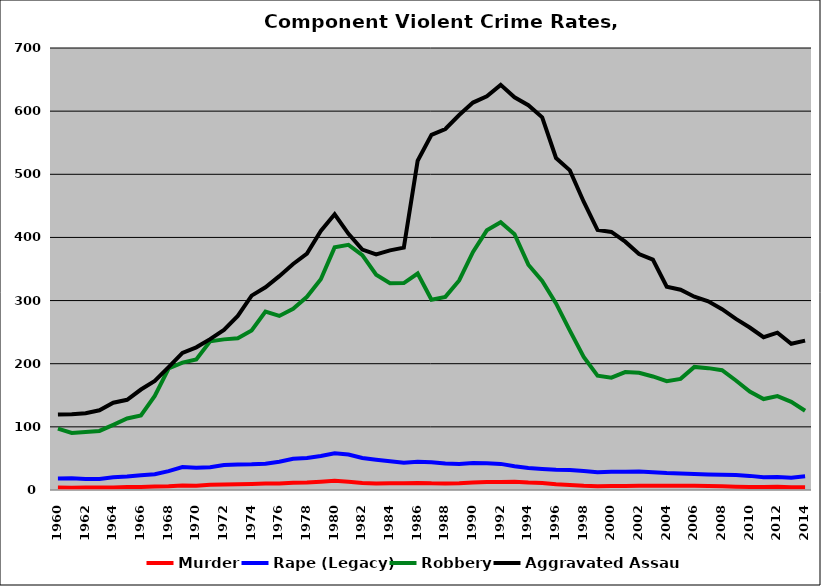
| Category | Murder | Rape (Legacy) | Robbery | Aggravated Assault |
|---|---|---|---|---|
| 1960.0 | 3.919 | 18.19 | 97.263 | 119.589 |
| 1961.0 | 3.69 | 18.497 | 90.456 | 120.046 |
| 1962.0 | 3.872 | 17.36 | 91.915 | 121.656 |
| 1963.0 | 3.826 | 17.51 | 93.565 | 126.254 |
| 1964.0 | 4.092 | 20.023 | 103.224 | 138.233 |
| 1965.0 | 4.731 | 21.224 | 113.327 | 142.893 |
| 1966.0 | 4.588 | 23.427 | 117.967 | 159.113 |
| 1967.0 | 5.425 | 25.02 | 149.005 | 172.694 |
| 1968.0 | 5.983 | 29.884 | 192.451 | 194.62 |
| 1969.0 | 7.129 | 36.275 | 201.821 | 217.04 |
| 1970.0 | 6.896 | 35.107 | 206.87 | 225.944 |
| 1971.0 | 8.119 | 36.098 | 235.504 | 238.857 |
| 1972.0 | 8.75 | 39.706 | 238.563 | 253.664 |
| 1973.0 | 9.038 | 40.566 | 240.43 | 275.778 |
| 1974.0 | 9.494 | 40.628 | 252.652 | 307.825 |
| 1975.0 | 10.427 | 41.572 | 282.403 | 320.977 |
| 1976.0 | 10.316 | 44.675 | 275.641 | 338.704 |
| 1977.0 | 11.486 | 49.438 | 287.048 | 358.011 |
| 1978.0 | 11.712 | 50.758 | 306.069 | 374.379 |
| 1979.0 | 13.007 | 53.926 | 333.834 | 410.332 |
| 1980.0 | 14.495 | 58.187 | 384.232 | 436.695 |
| 1981.0 | 13.01 | 56.153 | 388.182 | 405.625 |
| 1982.0 | 11.24 | 50.675 | 372.06 | 380.735 |
| 1983.0 | 10.483 | 48.038 | 340.931 | 373.135 |
| 1984.0 | 10.604 | 45.672 | 327.547 | 379.541 |
| 1985.0 | 10.506 | 43.319 | 327.658 | 383.785 |
| 1986.0 | 11.26 | 44.917 | 342.878 | 521.482 |
| 1987.0 | 10.57 | 43.773 | 301.272 | 562.372 |
| 1988.0 | 10.423 | 41.821 | 305.812 | 571.766 |
| 1989.0 | 10.866 | 41.173 | 331.8 | 593.817 |
| 1990.0 | 11.939 | 42.634 | 377.043 | 613.582 |
| 1991.0 | 12.702 | 42.449 | 411.254 | 623.529 |
| 1992.0 | 12.703 | 41.342 | 424.068 | 641.608 |
| 1993.0 | 13.124 | 37.698 | 405.101 | 621.842 |
| 1994.0 | 11.781 | 34.946 | 356.845 | 609.424 |
| 1995.0 | 11.178 | 33.41 | 331.163 | 590.262 |
| 1996.0 | 9.147 | 32.135 | 295.571 | 525.798 |
| 1997.0 | 7.992 | 31.576 | 252.473 | 506.217 |
| 1998.0 | 6.646 | 29.945 | 210.555 | 456.571 |
| 1999.0 | 6.049 | 28.249 | 181.14 | 411.741 |
| 2000.0 | 6.138 | 28.888 | 177.874 | 408.654 |
| 2001.0 | 6.376 | 28.786 | 186.743 | 393.31 |
| 2002.0 | 6.842 | 29.135 | 185.612 | 373.77 |
| 2003.0 | 6.787 | 28.182 | 179.823 | 364.834 |
| 2004.0 | 6.674 | 26.826 | 172.334 | 321.968 |
| 2005.0 | 6.923 | 25.978 | 175.974 | 317.145 |
| 2006.0 | 6.83 | 25.303 | 194.95 | 306.178 |
| 2007.0 | 6.183 | 24.657 | 192.984 | 298.767 |
| 2008.0 | 5.856 | 24.338 | 189.678 | 286.337 |
| 2009.0 | 5.335 | 23.573 | 173.404 | 270.973 |
| 2010.0 | 4.856 | 22.363 | 156 | 257.361 |
| 2011.0 | 4.755 | 20.34 | 144.069 | 242 |
| 2012.0 | 4.958 | 20.624 | 148.74 | 249.217 |
| 2013.0 | 4.543 | 19.422 | 139.573 | 231.657 |
| 2014.0 | 4.379 | 21.643 | 125.456 | 236.59 |